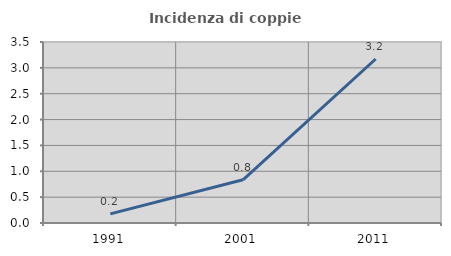
| Category | Incidenza di coppie miste |
|---|---|
| 1991.0 | 0.177 |
| 2001.0 | 0.835 |
| 2011.0 | 3.171 |